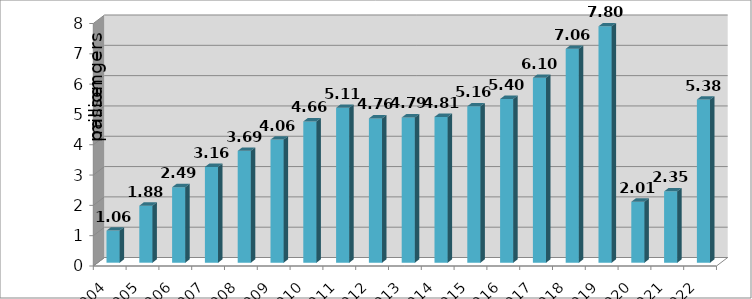
| Category | Series 0 |
|---|---|
| 2004.0 | 1.06 |
| 2005.0 | 1.88 |
| 2006.0 | 2.49 |
| 2007.0 | 3.16 |
| 2008.0 | 3.69 |
| 2009.0 | 4.06 |
| 2010.0 | 4.66 |
| 2011.0 | 5.11 |
| 2012.0 | 4.76 |
| 2013.0 | 4.79 |
| 2014.0 | 4.81 |
| 2015.0 | 5.16 |
| 2016.0 | 5.4 |
| 2017.0 | 6.1 |
| 2018.0 | 7.056 |
| 2019.0 | 7.797 |
| 2020.0 | 2.011 |
| 2021.0 | 2.353 |
| 2022.0 | 5.381 |